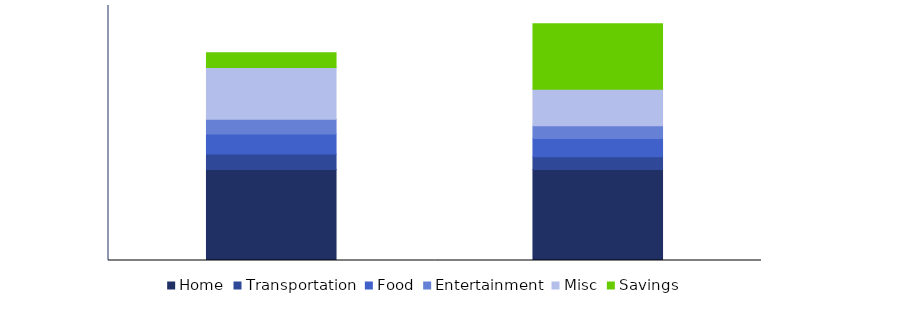
| Category | Home | Transportation | Food | Entertainment | Misc | Savings |
|---|---|---|---|---|---|---|
| 0 | 2500 | 425 | 550 | 400 | 1420 | 405 |
| 1 | 2500 | 350 | 500 | 350 | 1000 | 1800 |